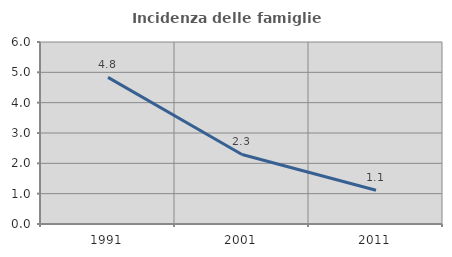
| Category | Incidenza delle famiglie numerose |
|---|---|
| 1991.0 | 4.835 |
| 2001.0 | 2.292 |
| 2011.0 | 1.113 |